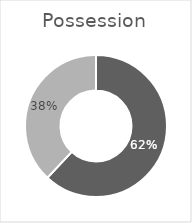
| Category | Possession |
|---|---|
| Liverpool | 0.62 |
| Manchester United | 0.38 |